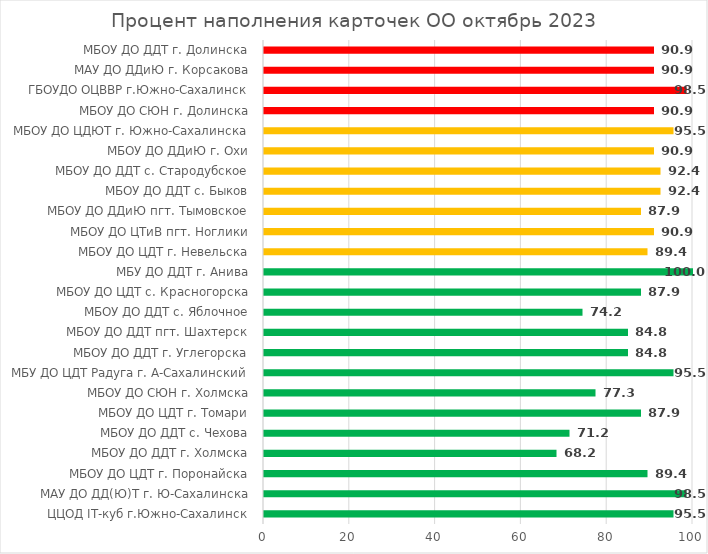
| Category | Процент наполнения карточек ОО  октябрь 2023 |
|---|---|
| ЦЦОД IT-куб г.Южно-Сахалинск | 95.455 |
| МАУ ДО ДД(Ю)Т г. Ю-Сахалинска | 98.485 |
| МБОУ ДО ЦДТ г. Поронайска | 89.394 |
| МБОУ ДО ДДТ г. Холмска | 68.182 |
| МБОУ ДО ДДТ с. Чехова | 71.212 |
| МБОУ ДО ЦДТ г. Томари | 87.879 |
| МБОУ ДО СЮН г. Холмска | 77.273 |
| МБУ ДО ЦДТ Радуга г. А-Сахалинский | 95.455 |
| МБОУ ДО ДДТ г. Углегорска | 84.848 |
| МБОУ ДО ДДТ пгт. Шахтерск | 84.848 |
| МБОУ ДО ДДТ с. Яблочное | 74.242 |
| МБОУ ДО ЦДТ с. Красногорска | 87.879 |
| МБУ ДО ДДТ г. Анива | 100 |
| МБОУ ДО ЦДТ г. Невельска | 89.394 |
| МБОУ ДО ЦТиВ пгт. Ноглики | 90.909 |
| МБОУ ДО ДДиЮ пгт. Тымовское | 87.879 |
| МБОУ ДО ДДТ с. Быков | 92.424 |
| МБОУ ДО ДДТ с. Стародубское | 92.424 |
| МБОУ ДО ДДиЮ г. Охи | 90.909 |
| МБОУ ДО ЦДЮТ г. Южно-Сахалинска | 95.455 |
| МБОУ ДО СЮН г. Долинска | 90.909 |
| ГБОУДО ОЦВВР г.Южно-Сахалинск | 98.485 |
| МАУ ДО ДДиЮ г. Корсакова | 90.909 |
| МБОУ ДО ДДТ г. Долинска | 90.909 |